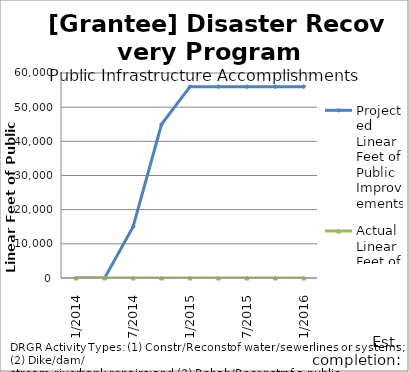
| Category | Projected Linear Feet of Public Improvements | Actual Linear Feet of Public Improvements |
|---|---|---|
| 1/2014 | 0 | 0 |
| 4/2014 | 0 | 0 |
| 7/2014 | 15000 | 0 |
| 10/2014 | 45000 | 0 |
| 1/2015 | 56000 | 0 |
| 4/2015 | 56000 | 0 |
| 7/2015 | 56000 | 0 |
| 10/2015 | 56000 | 0 |
| 1/2016 | 56000 | 0 |